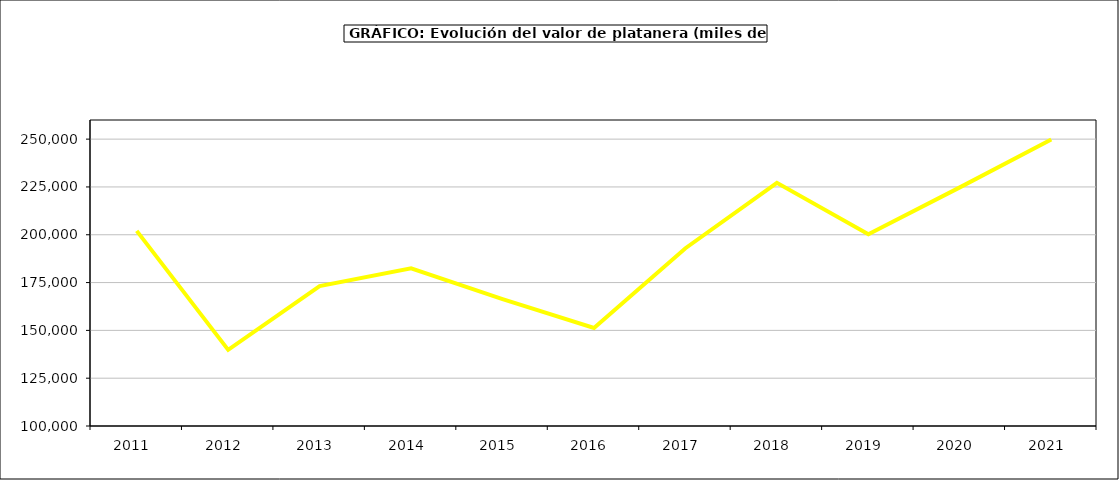
| Category | valor platanera |
|---|---|
| 2011.0 | 202014.747 |
| 2012.0 | 139816.382 |
| 2013.0 | 173165.464 |
| 2014.0 | 182466.749 |
| 2015.0 | 166392 |
| 2016.0 | 151266 |
| 2017.0 | 192961.354 |
| 2018.0 | 227178.133 |
| 2019.0 | 200278.061 |
| 2020.0 | 224777.04 |
| 2021.0 | 249841.034 |